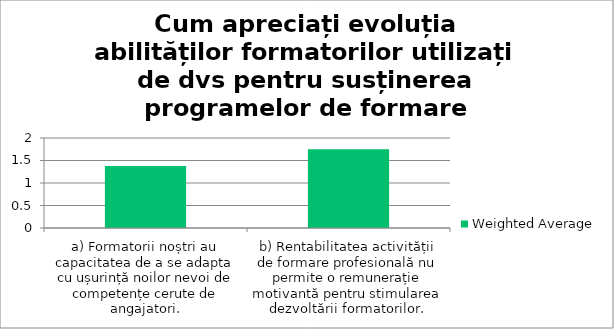
| Category | Weighted Average |
|---|---|
| a) Formatorii noștri au capacitatea de a se adapta cu ușurință noilor nevoi de competențe cerute de angajatori. | 1.38 |
| b) Rentabilitatea activității de formare profesională nu permite o remunerație motivantă pentru stimularea dezvoltării formatorilor. | 1.75 |